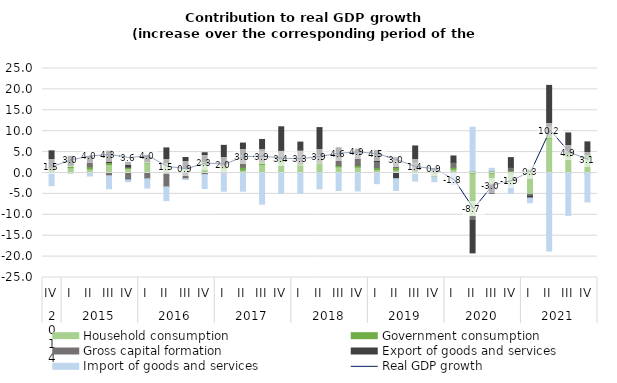
| Category | Household consumption | Government consumption | Gross capital formation | Export of goods and services | Import of goods and services |
|---|---|---|---|---|---|
| 0 | 0.524 | 0.633 | 0.238 | 3.907 | -3.032 |
| 1 | 1.292 | 0.595 | 0.024 | 2.073 | -0.008 |
| 2 | 0.957 | 0.546 | 1.114 | 1.376 | -0.73 |
| 3 | 2.021 | 0.495 | -0.672 | 2.712 | -3.08 |
| 4 | 1.05 | 0.366 | -1.67 | 1.14 | -0.425 |
| 5 | 2.447 | 0.323 | -1.389 | 1.435 | -2.222 |
| 6 | 2.16 | 0.314 | -3.328 | 3.529 | -3.29 |
| 7 | 0.891 | 0.38 | -1.379 | 2.437 | -0.2 |
| 8 | 2.229 | 0.537 | -0.378 | 2.079 | -3.341 |
| 9 | 1.204 | 0.599 | 0.319 | 4.488 | -4.356 |
| 10 | 0.711 | 0.678 | 2.98 | 2.794 | -4.356 |
| 11 | 2.048 | 0.652 | 2.631 | 2.692 | -7.467 |
| 12 | 2.609 | 0.535 | 2.344 | 5.567 | -4.884 |
| 13 | 1.815 | 0.427 | 3.445 | 1.708 | -4.825 |
| 14 | 2.275 | 0.33 | 1.821 | 6.434 | -3.775 |
| 15 | 1.489 | 0.317 | 2.036 | 2.184 | -4.185 |
| 16 | 1.392 | 0.386 | 3.024 | 0.908 | -4.3 |
| 17 | 0.771 | 0.499 | 1.488 | 2.634 | -2.554 |
| 18 | 0.706 | 0.591 | 2.447 | -1.365 | -2.812 |
| 19 | 0.049 | 0.624 | 1.976 | 3.822 | -1.936 |
| 20 | -0.963 | 0.582 | 0.254 | 0.168 | -1.1 |
| 21 | 0.883 | 0.509 | 1.191 | 1.496 | -2.783 |
| 22 | -10.436 | 0.435 | -0.957 | -7.712 | 10.51 |
| 23 | -2.692 | 0.483 | -0.409 | -1.708 | 0.643 |
| 24 | -2.939 | 0.585 | 0.783 | 2.313 | -1.873 |
| 25 | -5.13 | 0.708 | -0.422 | -0.43 | -1.135 |
| 26 | 8.4 | 0.93 | 1.965 | 9.668 | -18.683 |
| 27 | 3.873 | 0.893 | 0.953 | 3.872 | -10.14 |
| 28 | 3.517 | 0.863 | -0.065 | 3.061 | -6.863 |